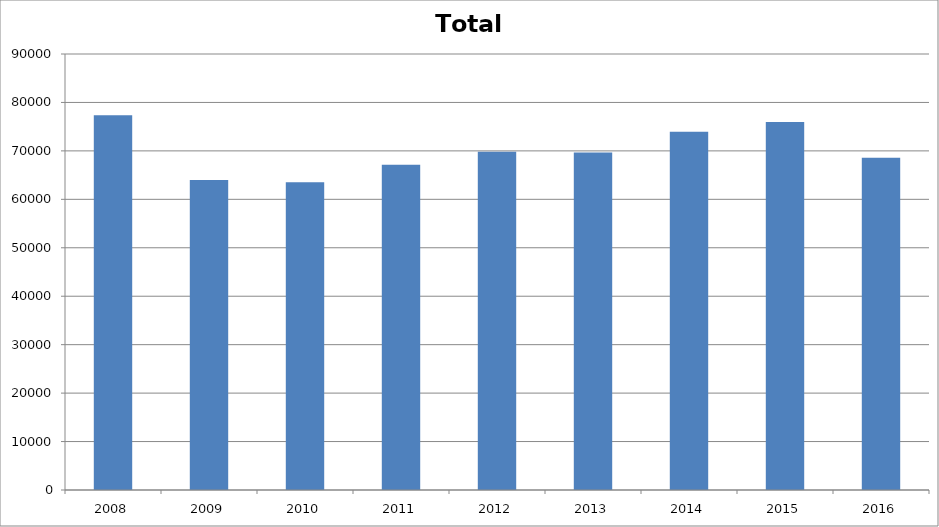
| Category | Total |
|---|---|
| 2008.0 | 77365 |
| 2009.0 | 64015 |
| 2010.0 | 63513 |
| 2011.0 | 67159 |
| 2012.0 | 69804 |
| 2013.0 | 69645 |
| 2014.0 | 73970 |
| 2015.0 | 75985 |
| 2016.0 | 68565 |